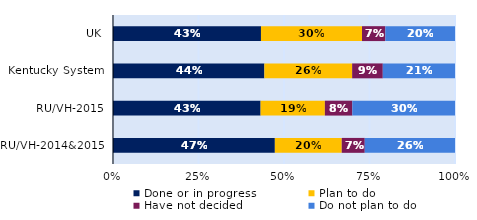
| Category | Done or in progress | Plan to do | Have not decided | Do not plan to do |
|---|---|---|---|---|
| UK | 0.433 | 0.295 | 0.068 | 0.204 |
| Kentucky System | 0.443 | 0.257 | 0.09 | 0.211 |
| RU/VH-2015 | 0.432 | 0.188 | 0.08 | 0.3 |
| RU/VH-2014&2015 | 0.473 | 0.196 | 0.067 | 0.264 |